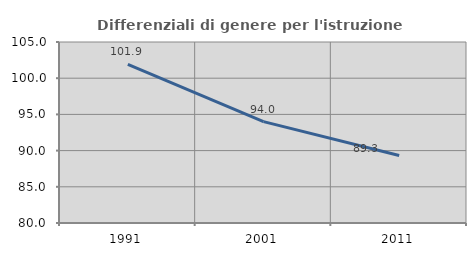
| Category | Differenziali di genere per l'istruzione superiore |
|---|---|
| 1991.0 | 101.898 |
| 2001.0 | 94.005 |
| 2011.0 | 89.333 |